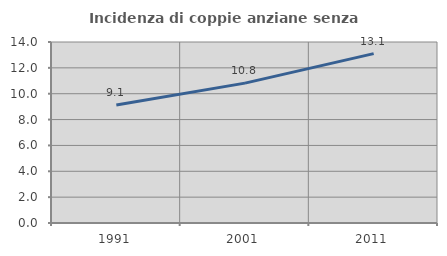
| Category | Incidenza di coppie anziane senza figli  |
|---|---|
| 1991.0 | 9.13 |
| 2001.0 | 10.82 |
| 2011.0 | 13.103 |